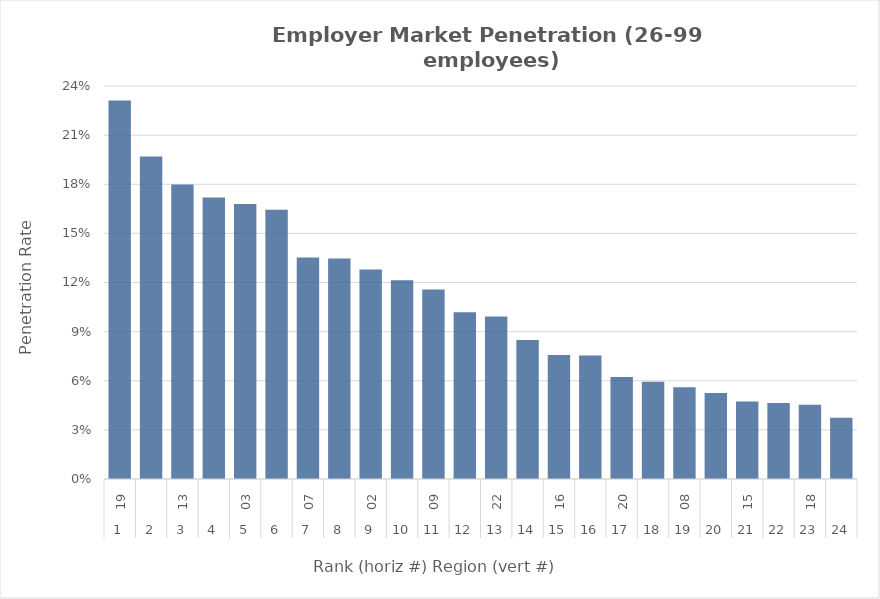
| Category | Rate |
|---|---|
| 0 | 0.231 |
| 1 | 0.197 |
| 2 | 0.18 |
| 3 | 0.172 |
| 4 | 0.168 |
| 5 | 0.164 |
| 6 | 0.135 |
| 7 | 0.135 |
| 8 | 0.128 |
| 9 | 0.121 |
| 10 | 0.116 |
| 11 | 0.102 |
| 12 | 0.099 |
| 13 | 0.085 |
| 14 | 0.076 |
| 15 | 0.075 |
| 16 | 0.062 |
| 17 | 0.059 |
| 18 | 0.056 |
| 19 | 0.052 |
| 20 | 0.047 |
| 21 | 0.046 |
| 22 | 0.045 |
| 23 | 0.037 |